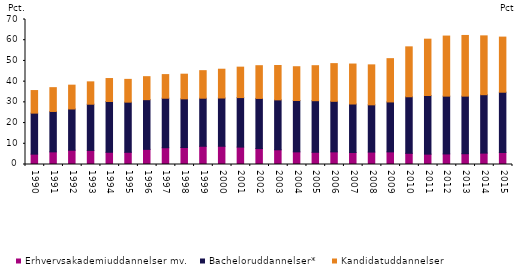
| Category | Erhvervsakademiuddannelser mv. | Bacheloruddannelser* | Kandidatuddannelser |
|---|---|---|---|
| 1990.0 | 5 | 19.8 | 10.9 |
| 1991.0 | 6.1 | 19.5 | 11.5 |
| 1992.0 | 6.9 | 19.9 | 11.5 |
| 1993.0 | 6.8 | 22.3 | 10.8 |
| 1994.0 | 5.9 | 24.5 | 11.1 |
| 1995.0 | 5.9 | 24.2 | 11 |
| 1996.0 | 7.3 | 24 | 11.1 |
| 1997.0 | 8.1 | 23.9 | 11.4 |
| 1998.0 | 8.2 | 23.5 | 11.9 |
| 1999.0 | 8.8 | 23.2 | 13.3 |
| 2000.0 | 8.8 | 23.3 | 13.9 |
| 2001.0 | 8.4 | 23.9 | 14.7 |
| 2002.0 | 7.7 | 24.2 | 15.8 |
| 2003.0 | 7.1 | 24.1 | 16.6 |
| 2004.0 | 6.1 | 24.8 | 16.3 |
| 2005.0 | 5.9 | 24.9 | 16.9 |
| 2006.0 | 6.1 | 24.4 | 18.2 |
| 2007.0 | 5.8 | 23.4 | 19.3 |
| 2008.0 | 6 | 22.8 | 19.3 |
| 2009.0 | 6.1 | 24.1 | 20.9 |
| 2010.0 | 5.4 | 27.3 | 24.1 |
| 2011.0 | 5 | 28.3 | 27.2 |
| 2012.0 | 5.1 | 27.9 | 29 |
| 2013.0 | 5.2 | 27.8 | 29.3 |
| 2014.0 | 5.5 | 28.2 | 28.4 |
| 2015.0 | 5.8 | 29.1 | 26.6 |